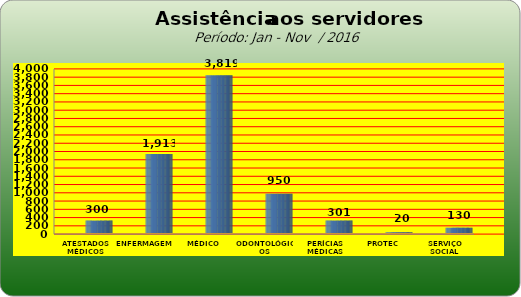
| Category | Series 0 |
|---|---|
| ATESTADOS MÉDICOS | 300 |
| ENFERMAGEM | 1913 |
| MÉDICO | 3819 |
| ODONTOLÓGICOS | 950 |
| PERÍCIAS MÉDICAS | 301 |
| PROTEC | 20 |
| SERVIÇO SOCIAL | 130 |